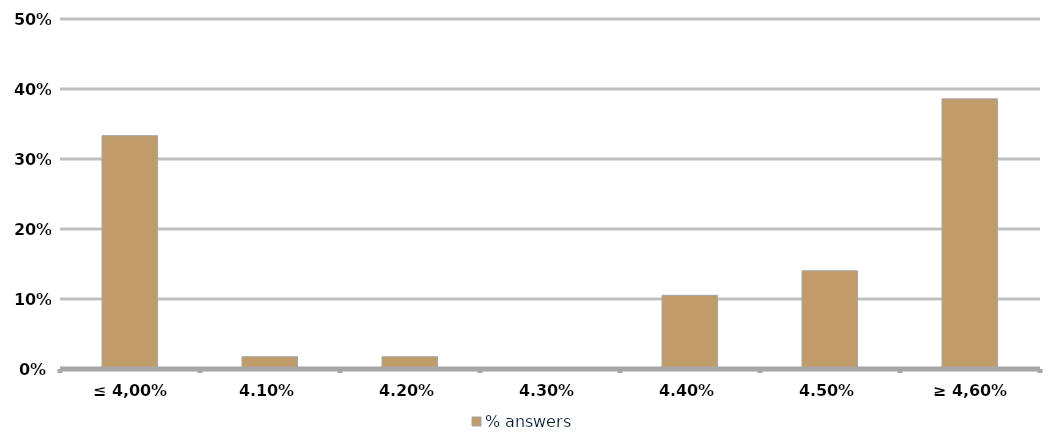
| Category | % answers |
|---|---|
| ≤ 4,00% | 0.333 |
| 4,10% | 0.018 |
| 4,20% | 0.018 |
| 4,30% | 0 |
| 4,40% | 0.105 |
| 4,50% | 0.14 |
| ≥ 4,60% | 0.386 |